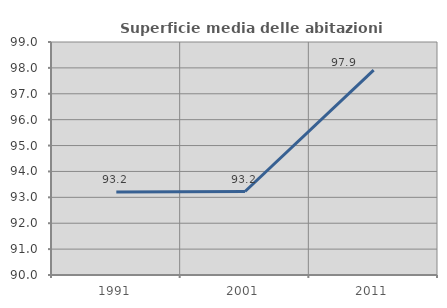
| Category | Superficie media delle abitazioni occupate |
|---|---|
| 1991.0 | 93.209 |
| 2001.0 | 93.224 |
| 2011.0 | 97.91 |